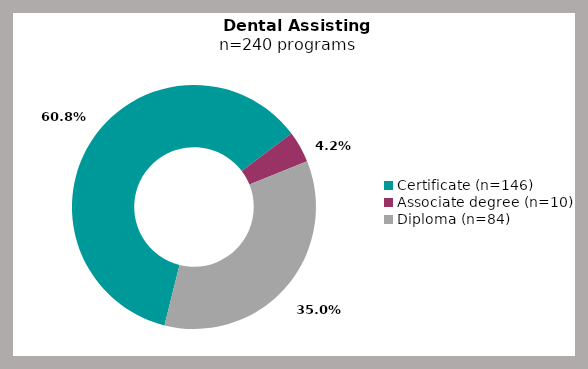
| Category | Series 0 |
|---|---|
| Certificate (n=146) | 0.608 |
| Associate degree (n=10) | 0.042 |
| Diploma (n=84) | 0.35 |